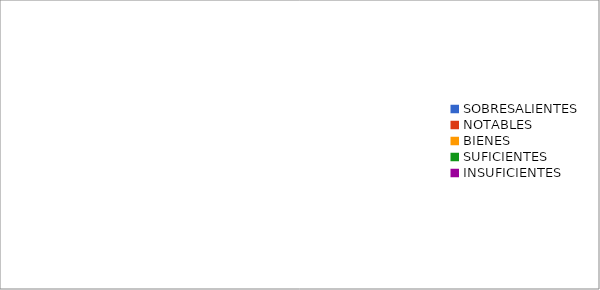
| Category | Series 0 |
|---|---|
| SOBRESALIENTES   | 0 |
| NOTABLES   | 0 |
| BIENES   | 0 |
| SUFICIENTES   | 0 |
| INSUFICIENTES   | 0 |